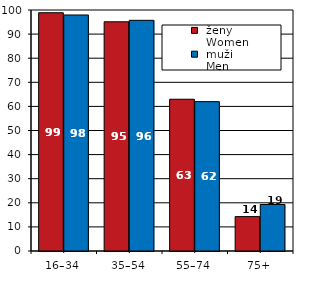
| Category |  ženy 
 Women |  muži 
 Men |
|---|---|---|
| 16–34 | 98.864 | 97.935 |
| 35–54 | 95.108 | 95.721 |
| 55–74 | 62.97 | 61.976 |
| 75+ | 14.274 | 19.298 |